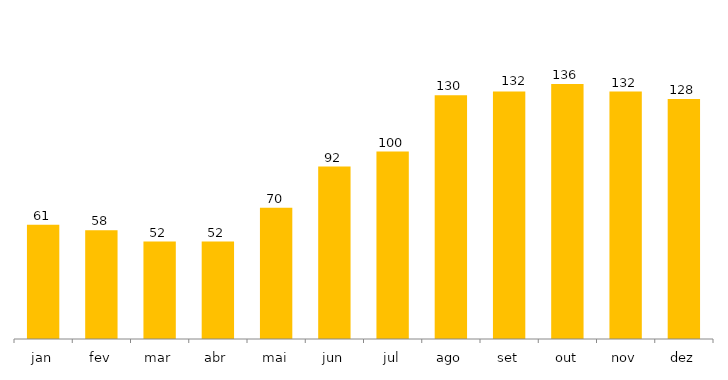
| Category | Total Geral |
|---|---|
| jan | 61 |
| fev | 58 |
| mar | 52 |
| abr | 52 |
| mai | 70 |
| jun | 92 |
| jul | 100 |
| ago | 130 |
| set | 132 |
| out | 136 |
| nov | 132 |
| dez | 128 |